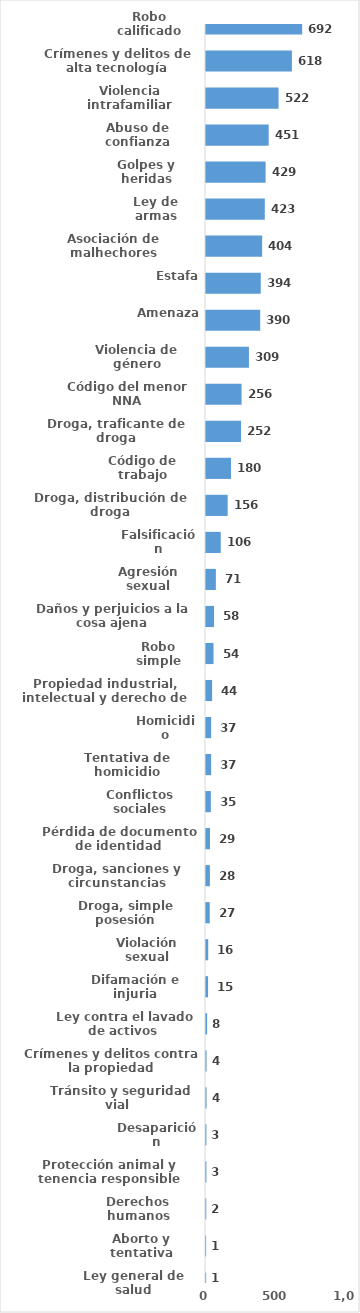
| Category | Series 0 |
|---|---|
| Robo calificado | 692 |
| Crímenes y delitos de alta tecnología | 618 |
| Violencia intrafamiliar | 522 |
| Abuso de confianza | 451 |
| Golpes y heridas | 429 |
| Ley de armas | 423 |
| Asociación de malhechores | 404 |
| Estafa | 394 |
| Amenaza | 390 |
| Violencia de género | 309 |
| Código del menor NNA | 256 |
| Droga, traficante de droga | 252 |
| Código de trabajo | 180 |
| Droga, distribución de droga | 156 |
| Falsificación | 106 |
| Agresión sexual | 71 |
| Daños y perjuicios a la cosa ajena | 58 |
| Robo simple | 54 |
| Propiedad industrial, intelectual y derecho de autor | 44 |
| Homicidio | 37 |
| Tentativa de homicidio | 37 |
| Conflictos sociales | 35 |
| Pérdida de documento de identidad | 29 |
| Droga, sanciones y circunstancias agravantes | 28 |
| Droga, simple posesión | 27 |
| Violación sexual | 16 |
| Difamación e injuria | 15 |
| Ley contra el lavado de activos  | 8 |
| Crímenes y delitos contra la propiedad | 4 |
| Tránsito y seguridad vial  | 4 |
| Desaparición | 3 |
| Protección animal y tenencia responsible | 3 |
| Derechos humanos | 2 |
| Aborto y tentativa | 1 |
| Ley general de salud | 1 |